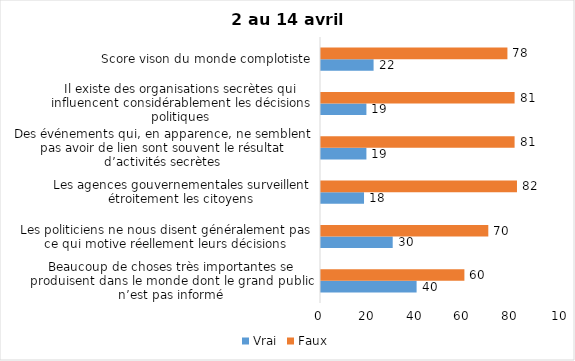
| Category | Vrai | Faux |
|---|---|---|
| Beaucoup de choses très importantes se produisent dans le monde dont le grand public n’est pas informé | 40 | 60 |
| Les politiciens ne nous disent généralement pas ce qui motive réellement leurs décisions | 30 | 70 |
| Les agences gouvernementales surveillent étroitement les citoyens | 18 | 82 |
| Des événements qui, en apparence, ne semblent pas avoir de lien sont souvent le résultat d’activités secrètes | 19 | 81 |
| Il existe des organisations secrètes qui influencent considérablement les décisions politiques | 19 | 81 |
| Score vison du monde complotiste | 22 | 78 |